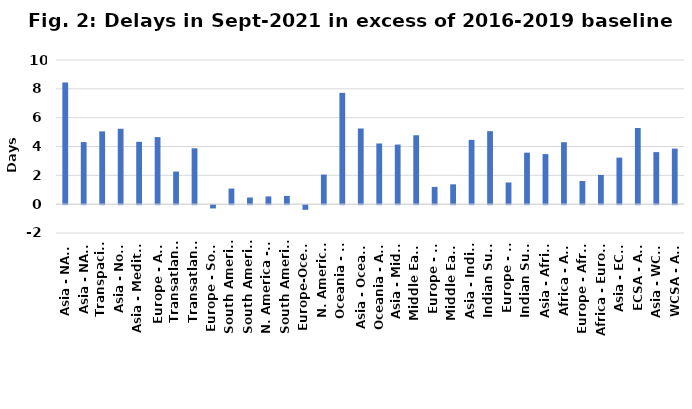
| Category | Sep-21 |
|---|---|
| Asia - NAWC | 8.442 |
| Asia - NAEC | 4.307 |
| Transpacific WB | 5.049 |
| Asia - North Europe | 5.23 |
| Asia - Mediterranean | 4.324 |
| Europe - Asia | 4.653 |
| Transatlantic EB | 2.264 |
| Transatlantic WB | 3.878 |
| Europe - South America | -0.228 |
| South America - N. Europe | 1.083 |
| South America - Med. | 0.463 |
| N. America - South America | 0.537 |
| South America - N. America | 0.575 |
| Europe-Oceania | -0.323 |
| N. America - Oceania | 2.054 |
| Oceania - N. America | 7.721 |
| Asia - Oceania | 5.25 |
| Oceania - Asia | 4.209 |
| Asia - Middle East | 4.135 |
| Middle East - Asia | 4.78 |
| Europe - Middle East | 1.196 |
| Middle East - Europe | 1.376 |
| Asia - Indian Sub. | 4.462 |
| Indian Sub. - Asia | 5.064 |
| Europe - Indian Sub. | 1.504 |
| Indian Sub. - Europe | 3.572 |
| Asia - Africa | 3.474 |
| Africa - Asia | 4.297 |
| Europe - Africa | 1.605 |
| Africa - Europe | 2.027 |
| Asia - ECSA | 3.227 |
| ECSA - Asia | 5.281 |
| Asia - WCSA | 3.612 |
| WCSA - Asia | 3.854 |